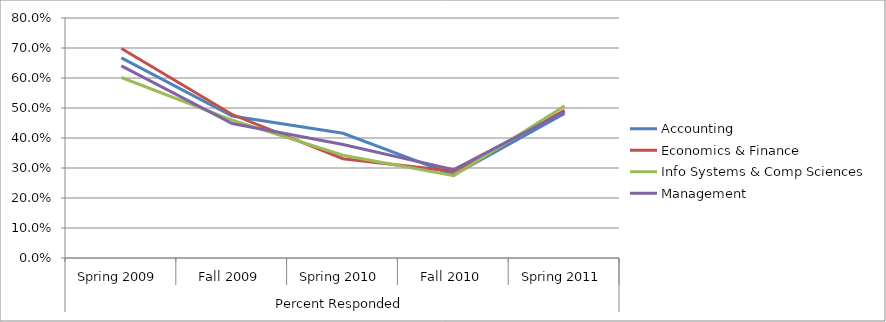
| Category | Accounting | Economics & Finance | Info Systems & Comp Sciences | Management |
|---|---|---|---|---|
| 0 | 0.667 | 0.698 | 0.602 | 0.641 |
| 1 | 0.473 | 0.478 | 0.46 | 0.448 |
| 2 | 0.416 | 0.331 | 0.342 | 0.378 |
| 3 | 0.277 | 0.289 | 0.274 | 0.295 |
| 4 | 0.482 | 0.493 | 0.507 | 0.488 |